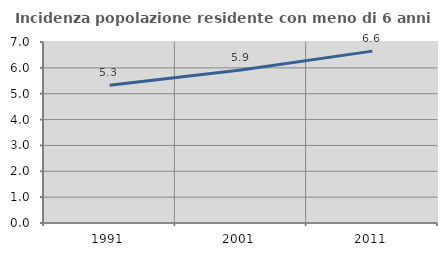
| Category | Incidenza popolazione residente con meno di 6 anni |
|---|---|
| 1991.0 | 5.326 |
| 2001.0 | 5.92 |
| 2011.0 | 6.647 |